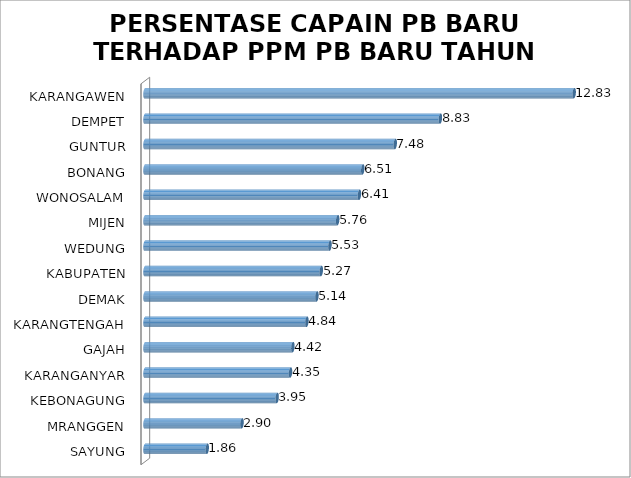
| Category | Series 0 |
|---|---|
| SAYUNG | 1.86 |
| MRANGGEN | 2.9 |
| KEBONAGUNG | 3.95 |
| KARANGANYAR | 4.35 |
| GAJAH | 4.42 |
| KARANGTENGAH | 4.84 |
| DEMAK | 5.14 |
| KABUPATEN | 5.27 |
| WEDUNG | 5.53 |
| MIJEN | 5.76 |
| WONOSALAM | 6.41 |
| BONANG | 6.51 |
| GUNTUR | 7.48 |
| DEMPET | 8.83 |
| KARANGAWEN | 12.83 |